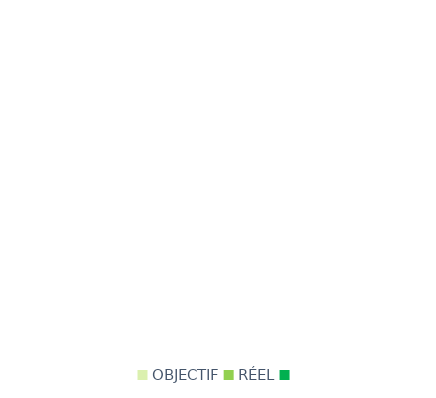
| Category | Series 0 |
|---|---|
| OBJECTIF | 0 |
| RÉEL | 0 |